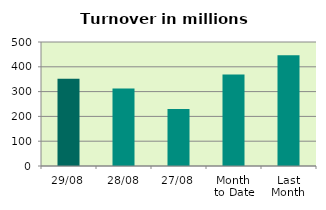
| Category | Series 0 |
|---|---|
| 29/08 | 351.509 |
| 28/08 | 312.142 |
| 27/08 | 229.642 |
| Month 
to Date | 368.709 |
| Last
Month | 446.279 |